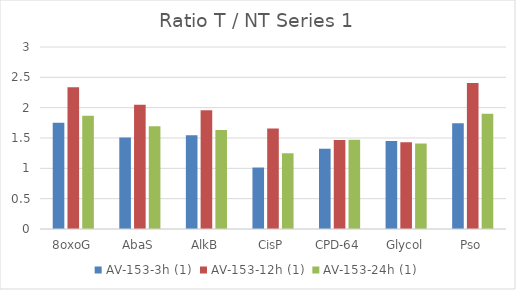
| Category | AV-153-3h (1) | AV-153-12h (1) | AV-153-24h (1) |
|---|---|---|---|
| 8oxoG | 1.753 | 2.336 | 1.867 |
| AbaS | 1.509 | 2.047 | 1.695 |
| AlkB | 1.543 | 1.958 | 1.633 |
| CisP | 1.013 | 1.655 | 1.249 |
| CPD-64 | 1.323 | 1.466 | 1.472 |
| Glycol | 1.451 | 1.429 | 1.409 |
| Pso | 1.744 | 2.406 | 1.902 |